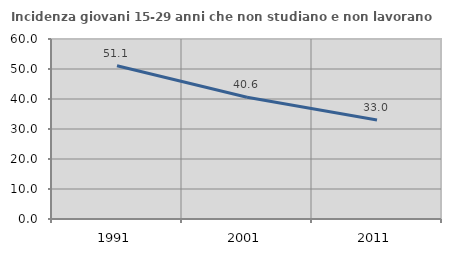
| Category | Incidenza giovani 15-29 anni che non studiano e non lavorano  |
|---|---|
| 1991.0 | 51.064 |
| 2001.0 | 40.592 |
| 2011.0 | 32.997 |